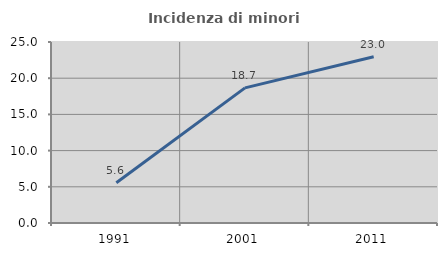
| Category | Incidenza di minori stranieri |
|---|---|
| 1991.0 | 5.556 |
| 2001.0 | 18.667 |
| 2011.0 | 22.965 |